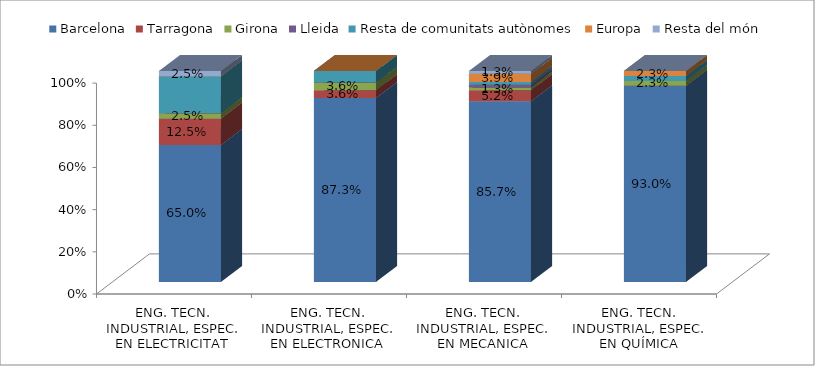
| Category | Barcelona | Tarragona | Girona | Lleida | Resta de comunitats autònomes | Europa | Resta del món |
|---|---|---|---|---|---|---|---|
| ENG. TECN. INDUSTRIAL, ESPEC. EN ELECTRICITAT | 0.65 | 0.125 | 0.025 | 0 | 0.175 | 0 | 0.025 |
| ENG. TECN. INDUSTRIAL, ESPEC. EN ELECTRONICA INDUSTRIAL | 0.873 | 0.036 | 0.036 | 0 | 0.055 | 0 | 0 |
| ENG. TECN. INDUSTRIAL, ESPEC. EN MECANICA | 0.857 | 0.052 | 0.013 | 0.013 | 0.013 | 0.039 | 0.013 |
| ENG. TECN. INDUSTRIAL, ESPEC. EN QUÍMICA INDUSTRIAL | 0.93 | 0 | 0.023 | 0 | 0.023 | 0.023 | 0 |